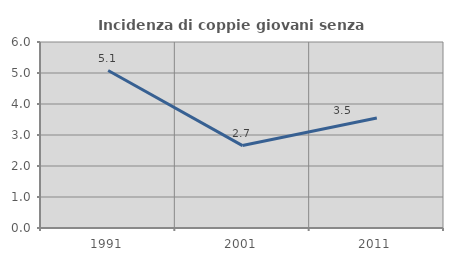
| Category | Incidenza di coppie giovani senza figli |
|---|---|
| 1991.0 | 5.079 |
| 2001.0 | 2.659 |
| 2011.0 | 3.55 |